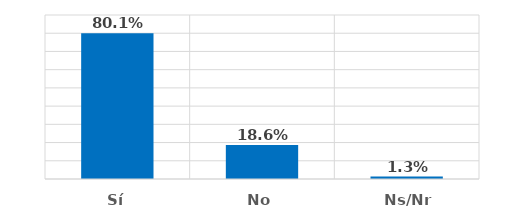
| Category | Series 0 |
|---|---|
| Sí | 0.801 |
| No | 0.186 |
| Ns/Nr | 0.013 |